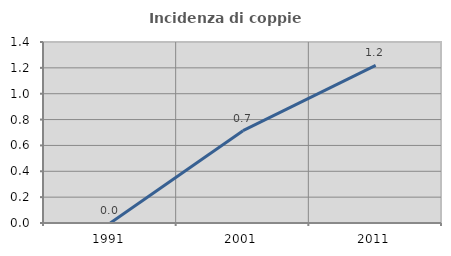
| Category | Incidenza di coppie miste |
|---|---|
| 1991.0 | 0 |
| 2001.0 | 0.714 |
| 2011.0 | 1.22 |